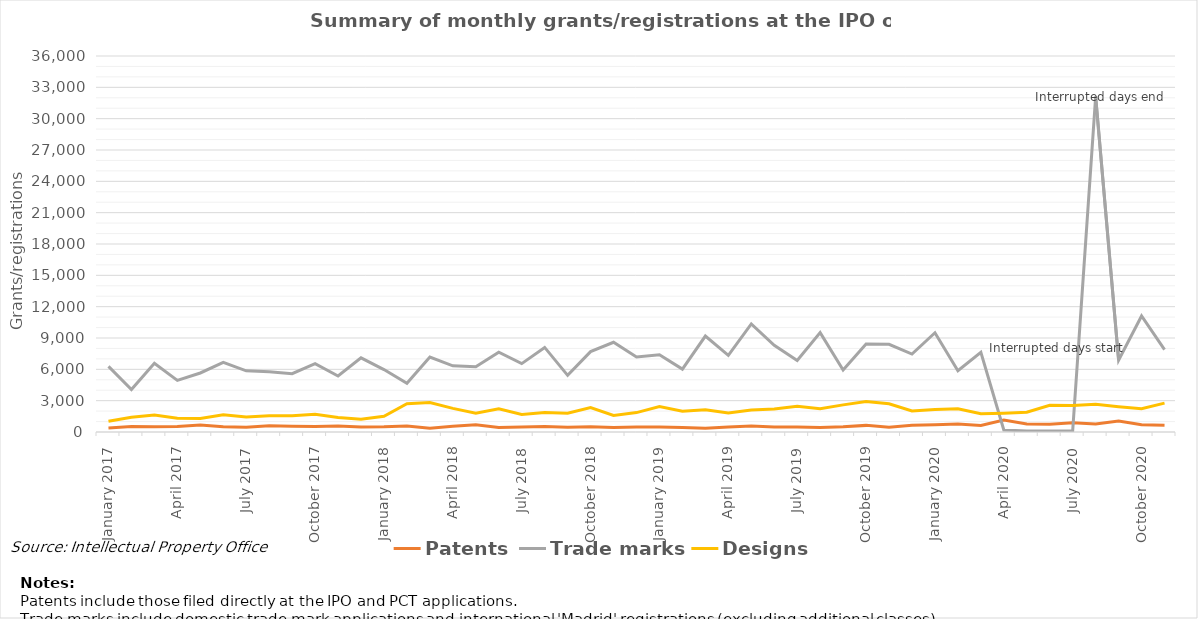
| Category | Patents | Trade marks | Designs |
|---|---|---|---|
| January 2017 | 387 | 6287 | 1026 |
| February 2017 | 533 | 4063 | 1420 |
| March 2017 | 505 | 6576 | 1631 |
| April 2017 | 516 | 4937 | 1318 |
| May 2017 | 681 | 5651 | 1284 |
| June 2017 | 495 | 6658 | 1660 |
| July 2017 | 466 | 5857 | 1437 |
| August 2017 | 592 | 5763 | 1550 |
| September 2017 | 554 | 5578 | 1553 |
| October 2017 | 517 | 6538 | 1705 |
| November 2017 | 578 | 5362 | 1397 |
| December 2017 | 487 | 7101 | 1218 |
| January 2018 | 495 | 5977 | 1512 |
| February 2018 | 574 | 4670 | 2704 |
| March 2018 | 370 | 7176 | 2825 |
| April 2018 | 543 | 6332 | 2259 |
| May 2018 | 690 | 6251 | 1789 |
| June 2018 | 424 | 7636 | 2222 |
| July 2018 | 486 | 6546 | 1678 |
| August 2018 | 536 | 8099 | 1878 |
| September 2018 | 450 | 5426 | 1795 |
| October 2018 | 498 | 7698 | 2348 |
| November 2018 | 432 | 8590 | 1592 |
| December 2018 | 484 | 7188 | 1859 |
| January 2019 | 475 | 7393 | 2444 |
| February 2019 | 426 | 6021 | 1987 |
| March 2019 | 363 | 9184 | 2125 |
| April 2019 | 488 | 7333 | 1810 |
| May 2019 | 573 | 10342 | 2096 |
| June 2019 | 471 | 8301 | 2202 |
| July 2019 | 489 | 6839 | 2464 |
| August 2019 | 420 | 9513 | 2219 |
| September 2019 | 500 | 5942 | 2596 |
| October 2019 | 634 | 8434 | 2926 |
| November 2019 | 455 | 8397 | 2700 |
| December 2019 | 654 | 7464 | 2021 |
| January 2020 | 696 | 9501 | 2145 |
| February 2020 | 756 | 5867 | 2220 |
| March 2020 | 622 | 7622 | 1758 |
| April 2020 | 1143 | 190 | 1803 |
| May 2020 | 768 | 103 | 1888 |
| June 2020 | 740 | 101 | 2566 |
| July 2020 | 878 | 129 | 2539 |
| August 2020 | 771 | 32107 | 2666 |
| September 2020 | 1042 | 6880 | 2428 |
| October 2020 | 697 | 11104 | 2223 |
| November 2020 | 649 | 7882 | 2765 |